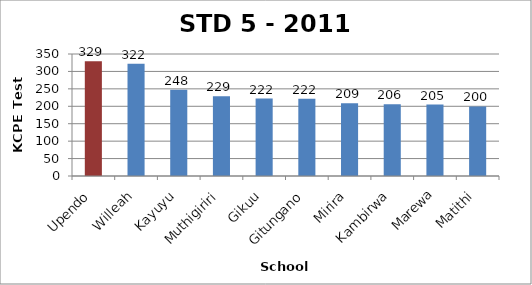
| Category | STD 5 Total Score |
|---|---|
| Upendo | 329.35 |
| Willeah | 322.17 |
| Kayuyu | 247.67 |
| Muthigiriri | 228.67 |
| Gikuu | 222 |
| Gitungano | 221.73 |
| Mirira | 208.55 |
| Kambirwa | 206 |
| Marewa | 204.81 |
| Matithi | 199.71 |